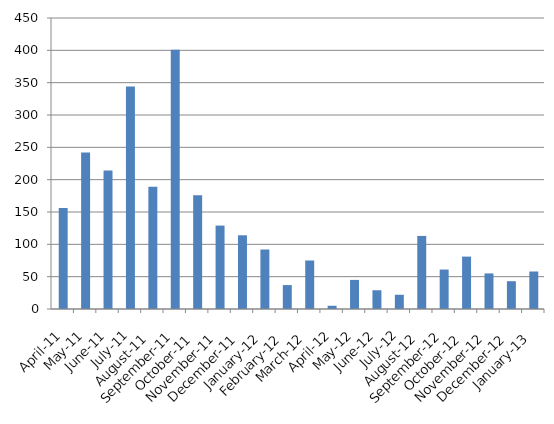
| Category | # |
|---|---|
| 2011-04-01 | 156 |
| 2011-05-02 | 242 |
| 2011-06-02 | 214 |
| 2011-07-02 | 344 |
| 2011-08-02 | 189 |
| 2011-09-02 | 401 |
| 2011-10-02 | 176 |
| 2011-11-02 | 129 |
| 2011-12-02 | 114 |
| 2012-01-02 | 92 |
| 2012-02-02 | 37 |
| 2012-03-02 | 75 |
| 2012-04-02 | 5 |
| 2012-05-02 | 45 |
| 2012-06-02 | 29 |
| 2012-07-02 | 22 |
| 2012-08-02 | 113 |
| 2012-09-02 | 61 |
| 2012-10-02 | 81 |
| 2012-11-02 | 55 |
| 2012-12-02 | 43 |
| 2013-01-02 | 58 |